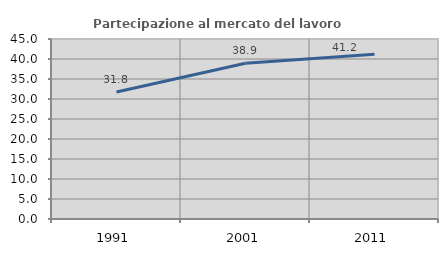
| Category | Partecipazione al mercato del lavoro  femminile |
|---|---|
| 1991.0 | 31.755 |
| 2001.0 | 38.946 |
| 2011.0 | 41.197 |